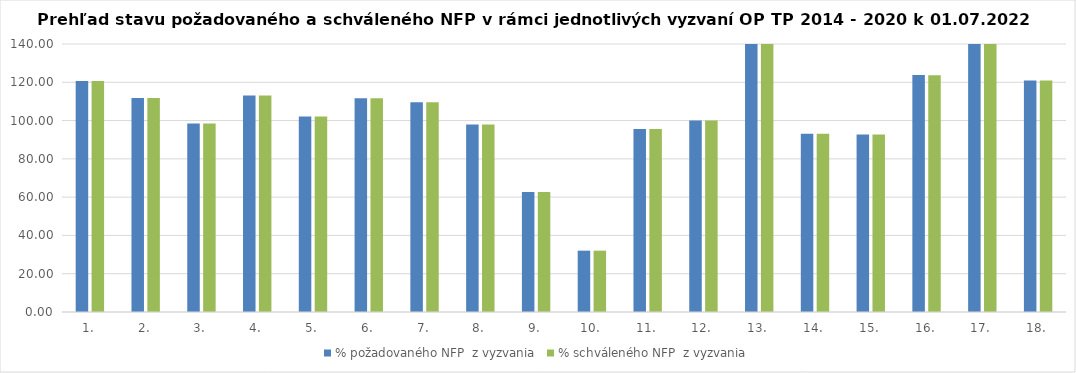
| Category | % požadovaného NFP  z vyzvania | % schváleného NFP  z vyzvania |
|---|---|---|
| 1. | 120.673 | 120.673 |
| 2. | 111.84 | 111.84 |
| 3. | 98.474 | 98.474 |
| 4. | 113.162 | 113.162 |
| 5. | 102.19 | 102.19 |
| 6. | 111.66 | 111.66 |
| 7. | 109.515 | 109.515 |
| 8. | 97.998 | 97.998 |
| 9. | 62.727 | 62.727 |
| 10. | 32.041 | 32.041 |
| 11. | 95.621 | 95.621 |
| 12. | 100.009 | 100.009 |
| 13. | 151.956 | 151.956 |
| 14. | 93.16 | 93.16 |
| 15. | 92.671 | 92.671 |
| 16. | 123.771 | 123.697 |
| 17. | 171.931 | 171.931 |
| 18. | 120.879 | 120.879 |